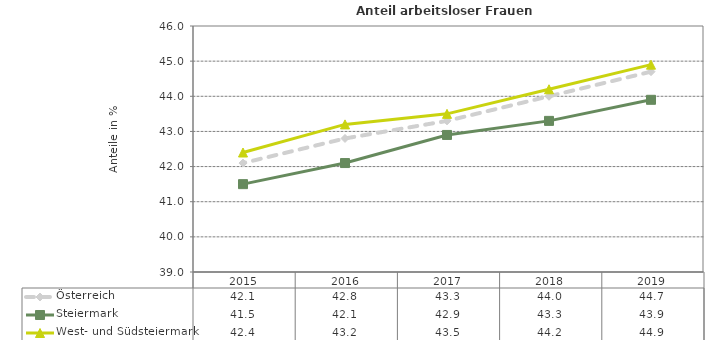
| Category | Österreich | Steiermark | West- und Südsteiermark |
|---|---|---|---|
| 2019.0 | 44.7 | 43.9 | 44.9 |
| 2018.0 | 44 | 43.3 | 44.2 |
| 2017.0 | 43.3 | 42.9 | 43.5 |
| 2016.0 | 42.8 | 42.1 | 43.2 |
| 2015.0 | 42.1 | 41.5 | 42.4 |